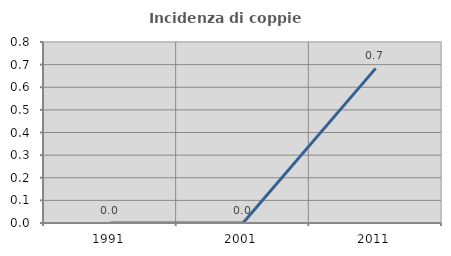
| Category | Incidenza di coppie miste |
|---|---|
| 1991.0 | 0 |
| 2001.0 | 0 |
| 2011.0 | 0.683 |